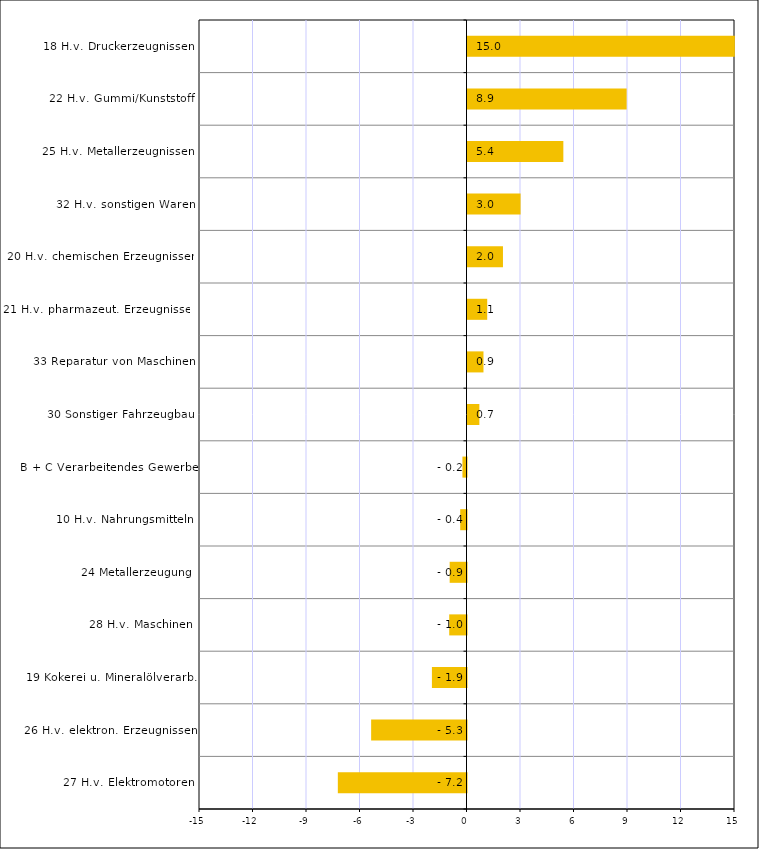
| Category | Series 0 |
|---|---|
| 27 H.v. Elektromotoren | -7.215 |
| 26 H.v. elektron. Erzeugnissen | -5.347 |
| 19 Kokerei u. Mineralölverarb. | -1.939 |
| 28 H.v. Maschinen | -0.969 |
| 24 Metallerzeugung | -0.944 |
| 10 H.v. Nahrungsmitteln | -0.353 |
| B + C Verarbeitendes Gewerbe | -0.228 |
| 30 Sonstiger Fahrzeugbau | 0.665 |
| 33 Reparatur von Maschinen | 0.896 |
| 21 H.v. pharmazeut. Erzeugnissen | 1.105 |
| 20 H.v. chemischen Erzeugnissen | 1.989 |
| 32 H.v. sonstigen Waren | 2.977 |
| 25 H.v. Metallerzeugnissen | 5.374 |
| 22 H.v. Gummi/Kunststoff | 8.923 |
| 18 H.v. Druckerzeugnissen | 14.991 |